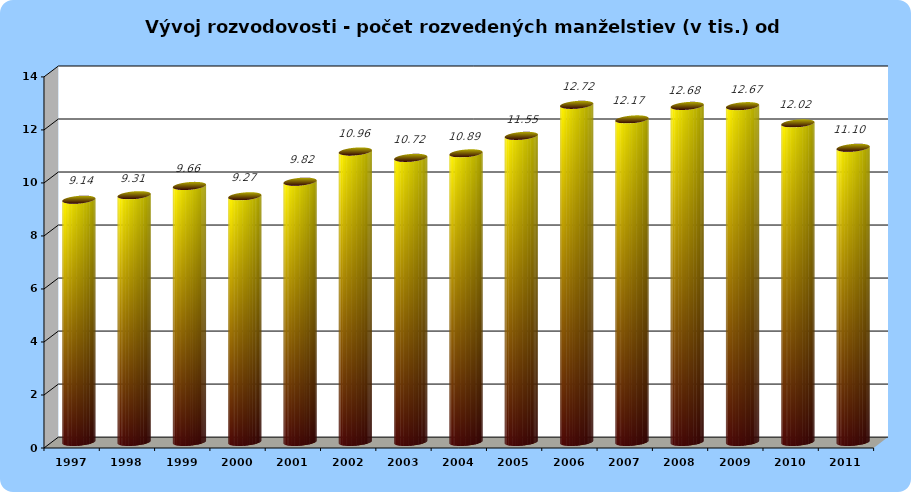
| Category | Series 0 |
|---|---|
| 1997.0 | 9.14 |
| 1998.0 | 9.31 |
| 1999.0 | 9.66 |
| 2000.0 | 9.27 |
| 2001.0 | 9.82 |
| 2002.0 | 10.96 |
| 2003.0 | 10.72 |
| 2004.0 | 10.89 |
| 2005.0 | 11.55 |
| 2006.0 | 12.72 |
| 2007.0 | 12.17 |
| 2008.0 | 12.68 |
| 2009.0 | 12.67 |
| 2010.0 | 12.02 |
| 2011.0 | 11.1 |